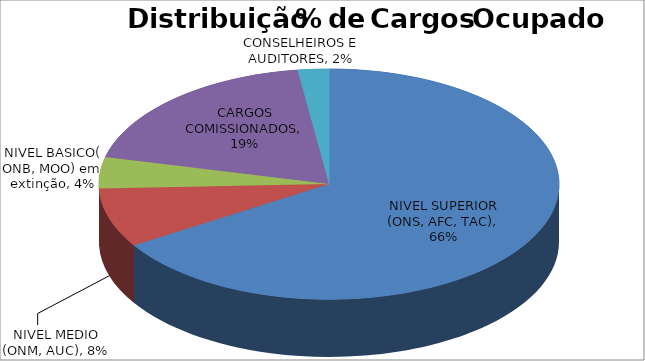
| Category | Series 0 |
|---|---|
| NIVEL SUPERIOR (ONS, AFC, TAC) | 0.661 |
| NIVEL MEDIO (ONM, AUC) | 0.083 |
| NIVEL BASICO( ONB, MOO) em extinção | 0.044 |
| CARGOS COMISSIONADOS | 0.19 |
| CONSELHEIROS E AUDITORES | 0.022 |